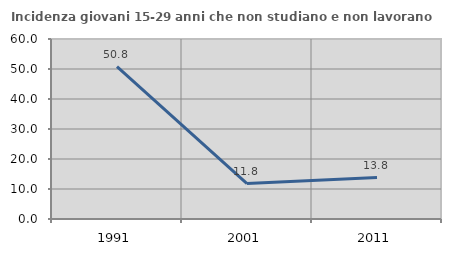
| Category | Incidenza giovani 15-29 anni che non studiano e non lavorano  |
|---|---|
| 1991.0 | 50.794 |
| 2001.0 | 11.805 |
| 2011.0 | 13.8 |